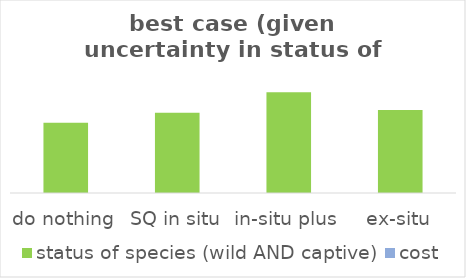
| Category | status of species (wild AND captive) | cost |
|---|---|---|
| do nothing | 0.697 | 0 |
| SQ in situ | 0.797 | 0 |
| in-situ plus | 1 | 0 |
| ex-situ | 0.823 | 0 |